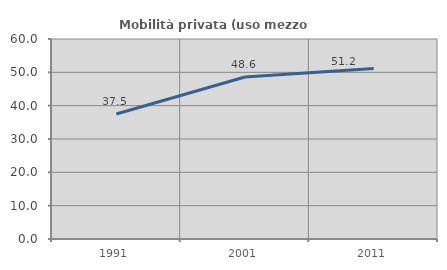
| Category | Mobilità privata (uso mezzo privato) |
|---|---|
| 1991.0 | 37.485 |
| 2001.0 | 48.613 |
| 2011.0 | 51.172 |